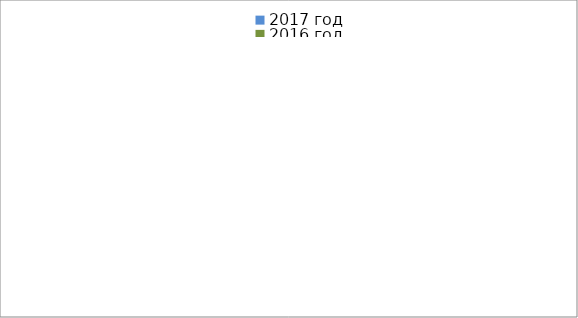
| Category | 2017 год | 2016 год |
|---|---|---|
|  - поджог | 4 | 6 |
|  - неосторожное обращение с огнём | 2 | 1 |
|  - НПТЭ электрооборудования | 8 | 4 |
|  - НПУ и Э печей | 23 | 18 |
|  - НПУ и Э транспортных средств | 22 | 22 |
|   -Шалость с огнем детей | 1 | 2 |
|  -НППБ при эксплуатации эл.приборов | 10 | 13 |
|  - курение | 10 | 11 |
| - прочие | 20 | 28 |
| - не установленные причины | 0 | 0 |